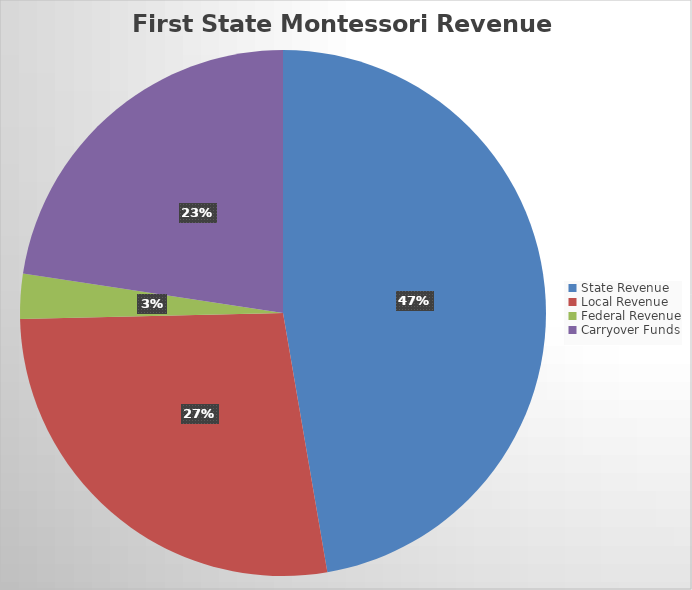
| Category | Series 0 |
|---|---|
| State Revenue | 5130874.36 |
| Local Revenue | 2965256.34 |
| Federal Revenue | 298826 |
| Carryover Funds | 2452130.34 |